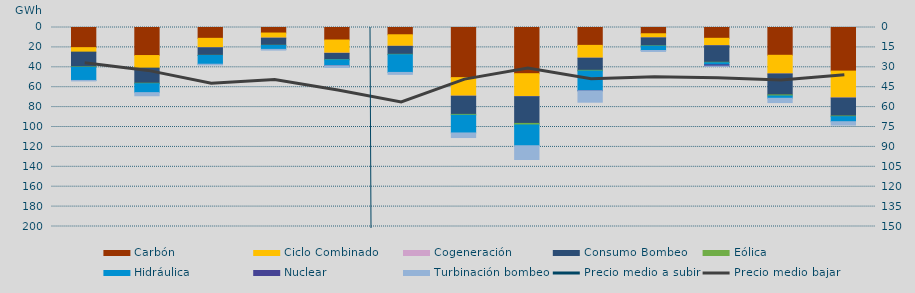
| Category | Carbón | Ciclo Combinado | Cogeneración | Consumo Bombeo | Eólica | Hidráulica | Nuclear | Turbinación bombeo |
|---|---|---|---|---|---|---|---|---|
| 0 | 20254.1 | 4502.5 | 0 | 14825.7 | 422.9 | 13215.2 | 0 | 462.9 |
| 1 | 28176.4 | 12664.3 | 0 | 15166.3 | 462.1 | 8996.5 | 0 | 3124.7 |
| 2 | 10892.6 | 9459.3 | 19 | 7585 | 201.8 | 8745.3 | 0 | 691.6 |
| 3 | 5563.5 | 5060.2 | 113 | 7129.2 | 169.4 | 3964.2 | 0 | 709 |
| 4 | 12581.1 | 13203.9 | 233 | 6261.8 | 220.5 | 5846.4 | 125 | 1688.7 |
| 5 | 7306.9 | 11559.1 | 88 | 7999 | 402.8 | 17797.7 | 0 | 1941.3 |
| 6 | 50376 | 18600.8 | 92.8 | 18257.2 | 867.9 | 17793.5 | 0 | 4596.7 |
| 7 | 46429 | 22875.8 | 230 | 26858.5 | 1566 | 20878.9 | 0 | 13810.2 |
| 8 | 17956.2 | 12815.5 | 103.4 | 12162.2 | 688.3 | 19850.2 | 66 | 11430.1 |
| 9 | 6283.8 | 4145.3 | 18.9 | 7977.8 | 313 | 4389.8 | 0 | 935.6 |
| 10 | 10864.5 | 7378.2 | 88.1 | 16621.4 | 464.4 | 2067.3 | 1381.8 | 160.4 |
| 11 | 27924.7 | 18737.8 | 26.5 | 21039.7 | 1083.3 | 2318.1 | 0 | 4314 |
| 12 | 43819.1 | 26947.4 | 131.4 | 18038.2 | 700.3 | 5037 | 0 | 3400 |